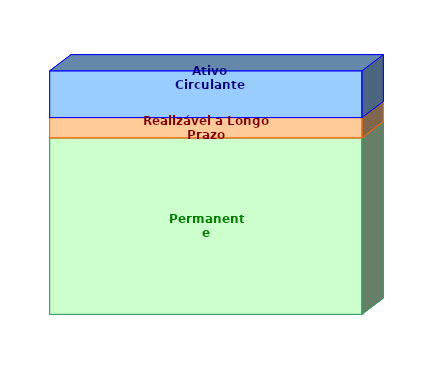
| Category | Permanente | Realizável a Longo Prazo | Ativo Circulante |
|---|---|---|---|
| 0 | 0.725 | 0.083 | 0.192 |